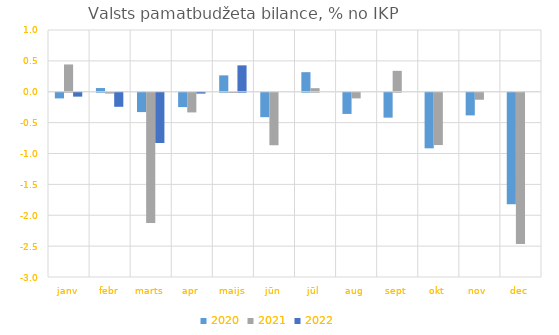
| Category | 2020 | 2021 | 2022 |
|---|---|---|---|
| janv | -0.092 | 0.442 | -0.063 |
| febr | 0.06 | -0.014 | -0.227 |
| marts | -0.313 | -2.11 | -0.814 |
| apr | -0.233 | -0.319 | -0.014 |
| maijs | 0.265 | -0.004 | 0.427 |
| jūn | -0.395 | -0.85 | 0 |
| jūl | 0.317 | 0.058 | 0 |
| aug | -0.343 | -0.091 | 0 |
| sept | -0.403 | 0.339 | 0 |
| okt | -0.9 | -0.847 | 0 |
| nov | -0.367 | -0.113 | 0 |
| dec | -1.806 | -2.448 | 0 |